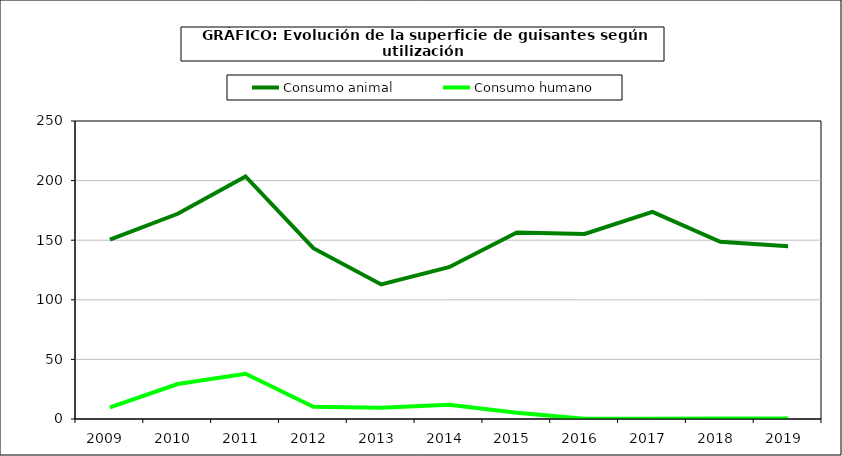
| Category | Consumo animal | Consumo humano |
|---|---|---|
| 2009.0 | 150.442 | 9.731 |
| 2010.0 | 172.145 | 29.313 |
| 2011.0 | 203.446 | 37.901 |
| 2012.0 | 143.303 | 10.179 |
| 2013.0 | 112.865 | 9.381 |
| 2014.0 | 127.342 | 12.044 |
| 2015.0 | 156.411 | 5.335 |
| 2016.0 | 155.246 | 0.163 |
| 2017.0 | 173.683 | 0.171 |
| 2018.0 | 148.651 | 0.369 |
| 2019.0 | 144.985 | 0.414 |